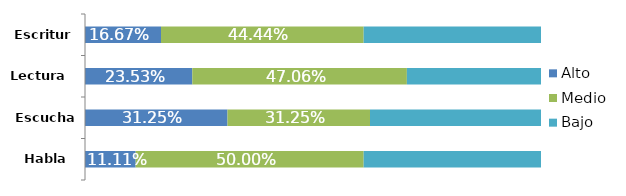
| Category | Alto | Medio | Bajo |
|---|---|---|---|
| Habla | 0.111 | 0.5 | 0.389 |
| Escucha | 0.312 | 0.312 | 0.375 |
| Lectura | 0.235 | 0.471 | 0.294 |
| Escritura | 0.167 | 0.444 | 0.389 |